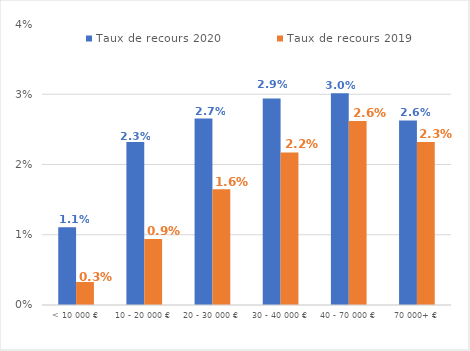
| Category | Taux de recours 2020 | Taux de recours 2019 |
|---|---|---|
| < 10 000 € | 0.011 | 0.003 |
| 10 - 20 000 € | 0.023 | 0.009 |
| 20 - 30 000 € | 0.027 | 0.016 |
| 30 - 40 000 € | 0.029 | 0.022 |
| 40 - 70 000 € | 0.03 | 0.026 |
| 70 000+ € | 0.026 | 0.023 |